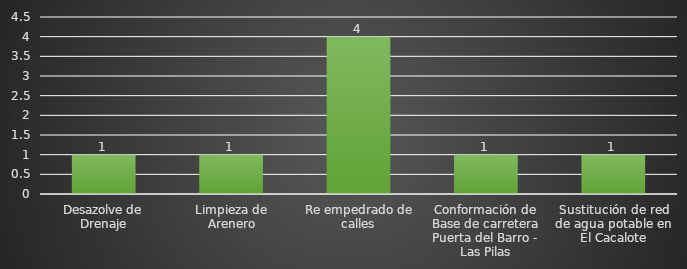
| Category | INDICADOR  |
|---|---|
| Desazolve de Drenaje | 1 |
| Limpieza de Arenero | 1 |
| Re empedrado de calles | 4 |
| Conformación de Base de carretera Puerta del Barro - Las Pilas | 1 |
| Sustitución de red de agua potable en El Cacalote | 1 |